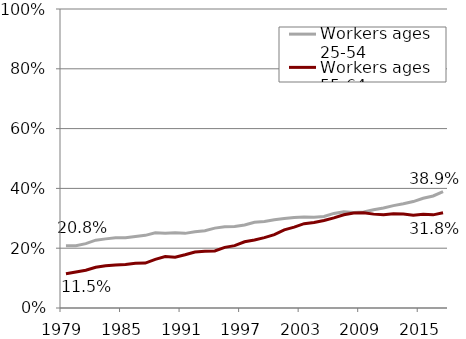
| Category | Workers ages 25-54 | Workers ages 55-64 |
|---|---|---|
| 1979.0 | 0.208 | 0.115 |
| 1980.0 | 0.208 | 0.121 |
| 1981.0 | 0.215 | 0.126 |
| 1982.0 | 0.227 | 0.136 |
| 1983.0 | 0.231 | 0.141 |
| 1984.0 | 0.235 | 0.144 |
| 1985.0 | 0.235 | 0.146 |
| 1986.0 | 0.239 | 0.149 |
| 1987.0 | 0.243 | 0.15 |
| 1988.0 | 0.251 | 0.163 |
| 1989.0 | 0.25 | 0.172 |
| 1990.0 | 0.252 | 0.17 |
| 1991.0 | 0.25 | 0.178 |
| 1992.0 | 0.255 | 0.187 |
| 1993.0 | 0.258 | 0.19 |
| 1994.0 | 0.267 | 0.191 |
| 1995.0 | 0.272 | 0.203 |
| 1996.0 | 0.272 | 0.209 |
| 1997.0 | 0.278 | 0.222 |
| 1998.0 | 0.286 | 0.228 |
| 1999.0 | 0.289 | 0.235 |
| 2000.0 | 0.295 | 0.245 |
| 2001.0 | 0.299 | 0.261 |
| 2002.0 | 0.303 | 0.27 |
| 2003.0 | 0.305 | 0.282 |
| 2004.0 | 0.304 | 0.286 |
| 2005.0 | 0.306 | 0.292 |
| 2006.0 | 0.316 | 0.301 |
| 2007.0 | 0.322 | 0.312 |
| 2008.0 | 0.319 | 0.317 |
| 2009.0 | 0.321 | 0.319 |
| 2010.0 | 0.329 | 0.314 |
| 2011.0 | 0.334 | 0.312 |
| 2012.0 | 0.342 | 0.315 |
| 2013.0 | 0.349 | 0.314 |
| 2014.0 | 0.356 | 0.31 |
| 2015.0 | 0.367 | 0.314 |
| 2016.0 | 0.375 | 0.312 |
| 2017.0 | 0.389 | 0.318 |